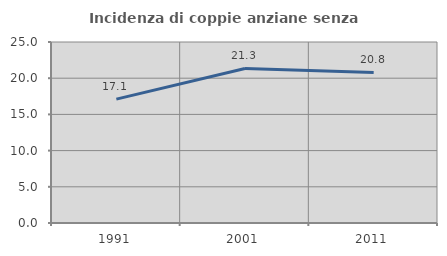
| Category | Incidenza di coppie anziane senza figli  |
|---|---|
| 1991.0 | 17.105 |
| 2001.0 | 21.341 |
| 2011.0 | 20.789 |